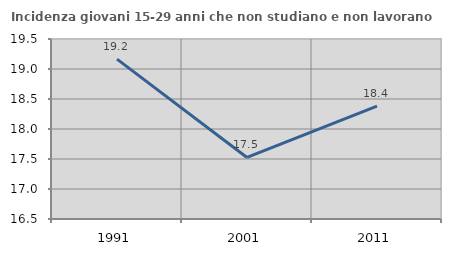
| Category | Incidenza giovani 15-29 anni che non studiano e non lavorano  |
|---|---|
| 1991.0 | 19.164 |
| 2001.0 | 17.526 |
| 2011.0 | 18.382 |